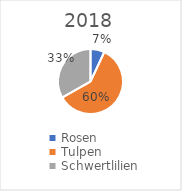
| Category | 2018 |
|---|---|
| Rosen | 0.07 |
| Tulpen | 0.6 |
| Schwertlilien | 0.333 |